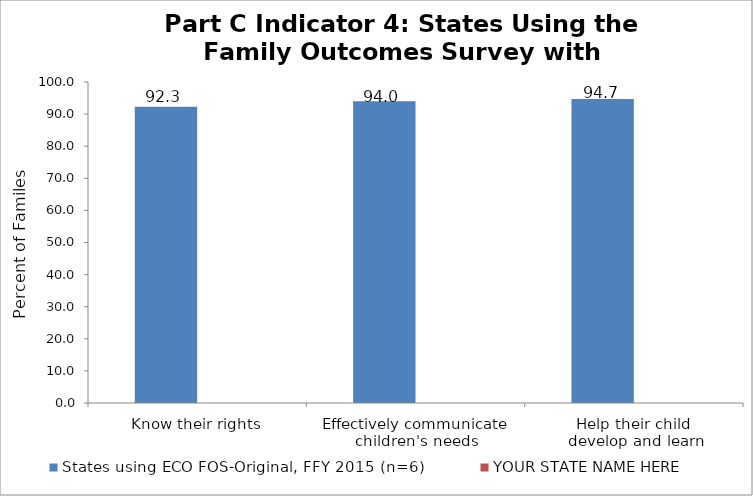
| Category | States using ECO FOS-Original, FFY 2015 (n=6) | YOUR STATE NAME HERE |
|---|---|---|
| Know their rights | 92.3 |  |
| Effectively communicate 
children's needs | 94 |  |
| Help their child 
develop and learn | 94.7 |  |